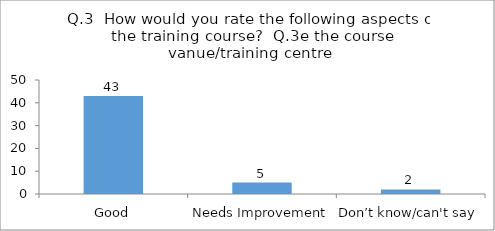
| Category | Q.3  How would you rate the following aspects of the training course?  |
|---|---|
| Good | 43 |
| Needs Improvement | 5 |
| Don’t know/can't say | 2 |